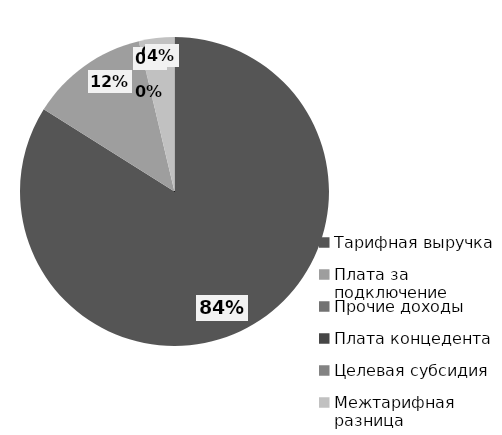
| Category | Series 0 |
|---|---|
| Тарифная выручка | 1099206.609 |
| Плата за подключение | 161664 |
| Прочие доходы | 0 |
| Плата концедента | 0 |
| Целевая субсидия | 0 |
| Межтарифная разница | 48595.555 |